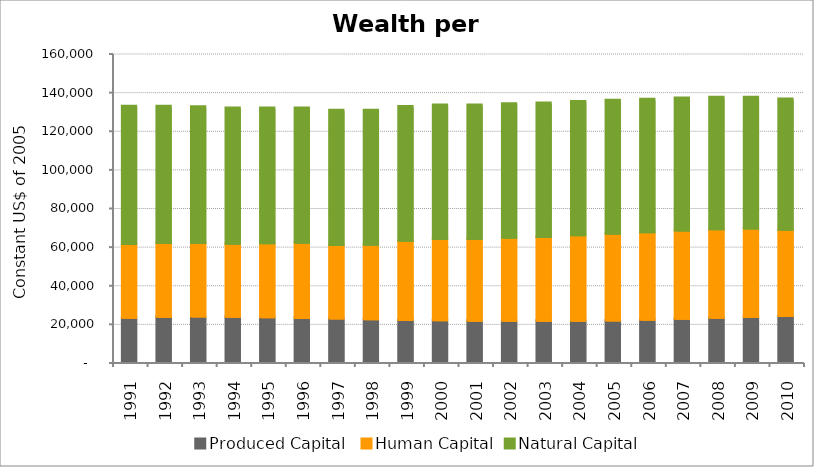
| Category | Produced Capital  | Human Capital | Natural Capital |
|---|---|---|---|
| 1991.0 | 22972.907 | 38131.573 | 71345.509 |
| 1992.0 | 23427.324 | 38172.859 | 70880.166 |
| 1993.0 | 23526.298 | 38062.208 | 70528.16 |
| 1994.0 | 23369.712 | 37834.054 | 70255.607 |
| 1995.0 | 23171.132 | 38273.996 | 70031.531 |
| 1996.0 | 22844.409 | 38863.236 | 69852.496 |
| 1997.0 | 22494.479 | 38105.594 | 69713.724 |
| 1998.0 | 22105.445 | 38646.376 | 69606.36 |
| 1999.0 | 21774.751 | 40962.838 | 69524.963 |
| 2000.0 | 21553.71 | 42096.132 | 69466.237 |
| 2001.0 | 21412.518 | 42256.264 | 69426.542 |
| 2002.0 | 21304.18 | 42983.826 | 69393.813 |
| 2003.0 | 21294.756 | 43468.427 | 69331.852 |
| 2004.0 | 21375.179 | 44274.505 | 69217.05 |
| 2005.0 | 21531.084 | 44899.724 | 69039.53 |
| 2006.0 | 21835.566 | 45318.388 | 68839.296 |
| 2007.0 | 22347.94 | 45749.168 | 68577.49 |
| 2008.0 | 22974.162 | 45783.72 | 68275.737 |
| 2009.0 | 23355.325 | 45718.966 | 67970.794 |
| 2010.0 | 23802.566 | 44704.491 | 67649.325 |